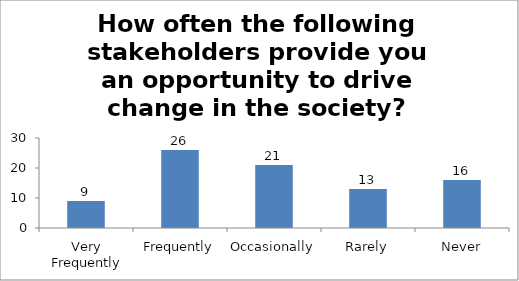
| Category | How often the following stakeholders provide you an opportunity to drive change in the society? (Government ) |
|---|---|
| Very Frequently | 9 |
| Frequently | 26 |
| Occasionally | 21 |
| Rarely | 13 |
| Never | 16 |